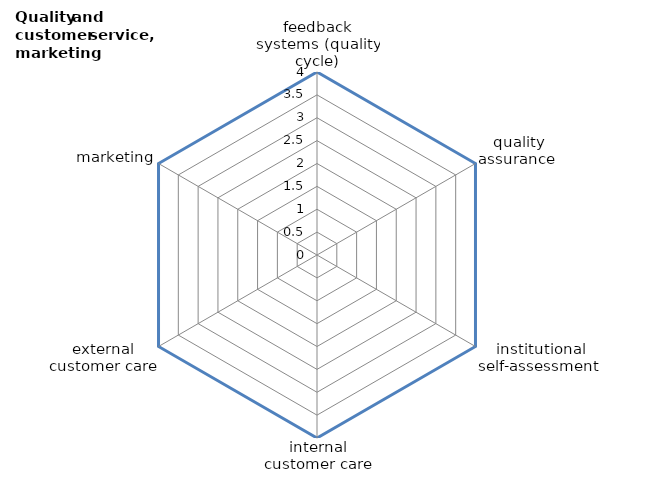
| Category | Series 0 | Series 1 |
|---|---|---|
| feedback systems (quality cycle) | 4 | 0 |
| quality assurance  | 4 | 0 |
| institutional self-assessment  | 4 | 0 |
| internal customer care | 4 | 0 |
| external customer care | 4 | 0 |
| marketing | 4 | 0 |